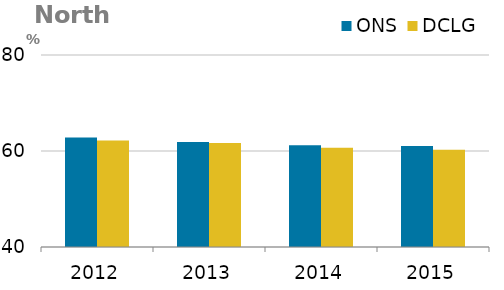
| Category | ONS | DCLG |
|---|---|---|
| 0 | 62.8 | 62.207 |
| 1 | 61.85 | 61.646 |
| 2 | 61.21 | 60.669 |
| 3 | 61.02 | 60.244 |